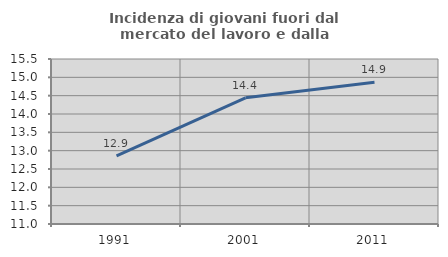
| Category | Incidenza di giovani fuori dal mercato del lavoro e dalla formazione  |
|---|---|
| 1991.0 | 12.86 |
| 2001.0 | 14.441 |
| 2011.0 | 14.865 |